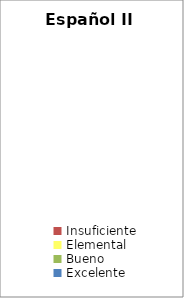
| Category | Español II |
|---|---|
| Insuficiente | 0 |
| Elemental | 0 |
| Bueno | 0 |
| Excelente | 0 |